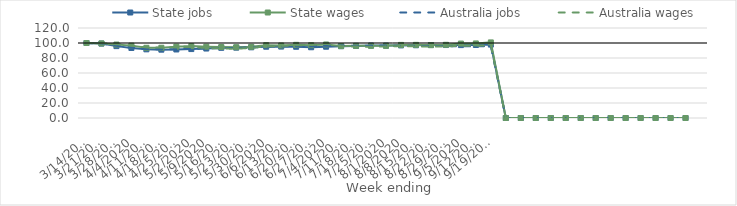
| Category | State jobs | State wages | Australia jobs | Australia wages |
|---|---|---|---|---|
| 14/03/2020 | 100 | 100 | 100 | 100 |
| 21/03/2020 | 99.194 | 99.445 | 99.278 | 99.672 |
| 28/03/2020 | 95.84 | 97.918 | 96.309 | 98.416 |
| 04/04/2020 | 93.359 | 96.501 | 93.652 | 96.688 |
| 11/04/2020 | 91.546 | 93.613 | 91.928 | 94.131 |
| 18/04/2020 | 91.096 | 93.652 | 91.47 | 94.024 |
| 25/04/2020 | 91.363 | 95.17 | 91.802 | 94.259 |
| 02/05/2020 | 91.904 | 95.845 | 92.199 | 94.709 |
| 09/05/2020 | 92.622 | 95.106 | 92.746 | 93.35 |
| 16/05/2020 | 93.567 | 94.669 | 93.278 | 92.689 |
| 23/05/2020 | 93.793 | 94.357 | 93.582 | 92.309 |
| 30/05/2020 | 94.266 | 94.896 | 94.088 | 93.584 |
| 06/06/2020 | 95.036 | 97.155 | 95.005 | 95.392 |
| 13/06/2020 | 95.243 | 96.717 | 95.464 | 96.09 |
| 20/06/2020 | 94.956 | 97.561 | 95.655 | 97.004 |
| 27/06/2020 | 94.314 | 97.068 | 95.595 | 97.247 |
| 04/07/2020 | 95.03 | 98.038 | 96.297 | 98.874 |
| 11/07/2020 | 95.747 | 95.903 | 96.584 | 95.79 |
| 18/07/2020 | 96.166 | 96.216 | 96.449 | 95.216 |
| 25/07/2020 | 96.634 | 96.189 | 96.501 | 94.86 |
| 01/08/2020 | 96.502 | 96.217 | 96.569 | 95.541 |
| 08/08/2020 | 96.783 | 97.461 | 96.344 | 95.915 |
| 15/08/2020 | 96.989 | 97.532 | 96.168 | 95.478 |
| 22/08/2020 | 97.258 | 97.13 | 96.063 | 95.259 |
| 29/08/2020 | 97.277 | 97.606 | 95.951 | 95.312 |
| 05/09/2020 | 97.199 | 99.268 | 95.576 | 96.393 |
| 12/09/2020 | 97.315 | 99.418 | 95.53 | 96.207 |
| 19/09/2020 | 97.859 | 100.789 | 95.881 | 97.123 |